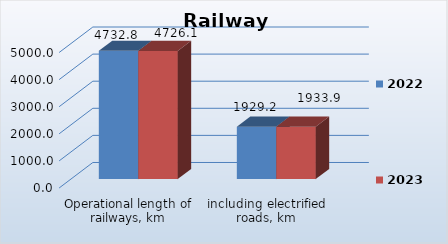
| Category | 2022 | 2023 |
|---|---|---|
| Operational length of railways, km | 4732.8 | 4726.1 |
| including electrified roads, km | 1929.2 | 1933.9 |